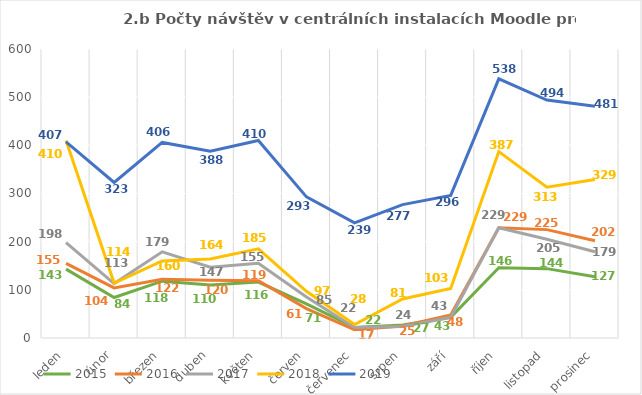
| Category | 2015 | 2016 | 2017 | 2018 | 2019 |
|---|---|---|---|---|---|
| leden | 143 | 155 | 198 | 410 | 407 |
| únor | 84 | 104 | 113 | 114 | 323 |
| březen | 118 | 122 | 179 | 160 | 406 |
| duben | 110 | 120 | 147 | 164 | 388 |
| květen | 116 | 119 | 155 | 185 | 410 |
| červen | 71 | 61 | 85 | 97 | 293 |
| červenec | 22 | 17 | 22 | 28 | 239 |
| srpen | 27 | 25 | 24 | 81 | 277 |
| září | 43 | 48 | 43 | 103 | 296 |
| říjen | 146 | 229 | 229 | 387 | 538 |
| listopad | 144 | 225 | 205 | 313 | 494 |
| prosinec | 127 | 202 | 179 | 329 | 481 |